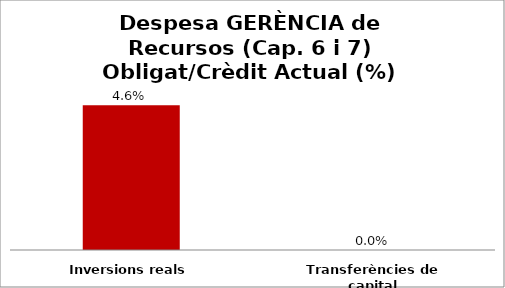
| Category | Series 0 |
|---|---|
| Inversions reals | 0.046 |
| Transferències de capital | 0 |